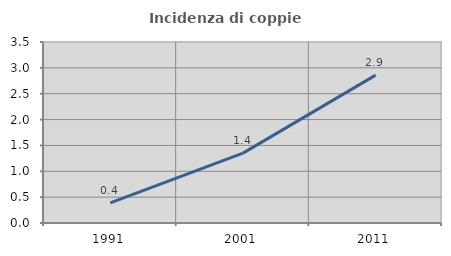
| Category | Incidenza di coppie miste |
|---|---|
| 1991.0 | 0.388 |
| 2001.0 | 1.35 |
| 2011.0 | 2.86 |